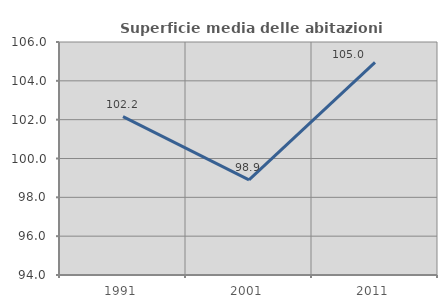
| Category | Superficie media delle abitazioni occupate |
|---|---|
| 1991.0 | 102.156 |
| 2001.0 | 98.903 |
| 2011.0 | 104.953 |